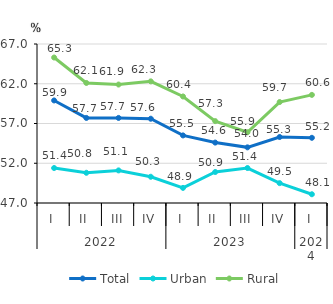
| Category | Total | Urban | Rural |
|---|---|---|---|
| 0 | 59.9 | 51.4 | 65.3 |
| 1 | 57.7 | 50.8 | 62.1 |
| 2 | 57.7 | 51.1 | 61.9 |
| 3 | 57.6 | 50.3 | 62.3 |
| 4 | 55.5 | 48.9 | 60.4 |
| 5 | 54.6 | 50.9 | 57.3 |
| 6 | 54 | 51.4 | 55.9 |
| 7 | 55.3 | 49.5 | 59.7 |
| 8 | 55.2 | 48.1 | 60.6 |